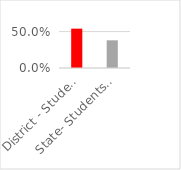
| Category | Series 1 |
|---|---|
| District - Students Proficient | 0.54 |
| State- Students Proficient | 0.38 |